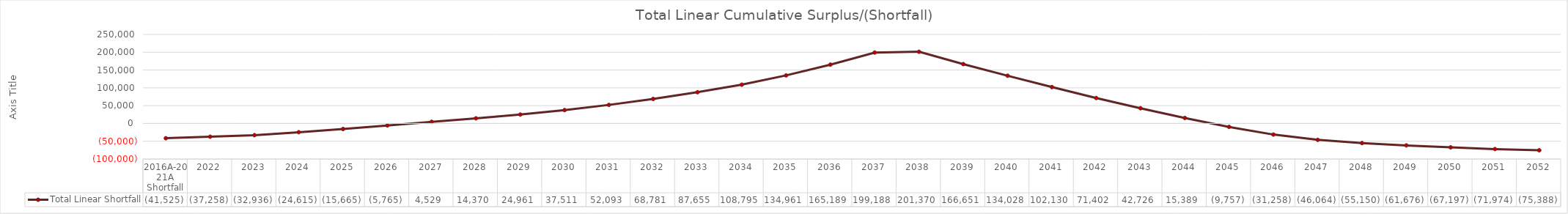
| Category | Total Linear Shortfall |
|---|---|
| 2016A-2021A Shortfall | -41524.912 |
| 2022 | -37258.029 |
| 2023 | -32935.982 |
| 2024 | -24614.684 |
| 2025 | -15665.037 |
| 2026 | -5764.722 |
| 2027 | 4529.242 |
| 2028 | 14369.784 |
| 2029 | 24960.691 |
| 2030 | 37510.813 |
| 2031 | 52092.678 |
| 2032 | 68781.5 |
| 2033 | 87655.275 |
| 2034 | 108794.889 |
| 2035 | 134960.636 |
| 2036 | 165189.188 |
| 2037 | 199188.242 |
| 2038 | 201370.138 |
| 2039 | 166651.392 |
| 2040 | 134027.664 |
| 2041 | 102129.861 |
| 2042 | 71401.963 |
| 2043 | 42726.093 |
| 2044 | 15389.064 |
| 2045 | -9756.845 |
| 2046 | -31257.796 |
| 2047 | -46064.335 |
| 2048 | -55149.871 |
| 2049 | -61675.882 |
| 2050 | -67196.626 |
| 2051 | -71973.949 |
| 2052 | -75388.119 |